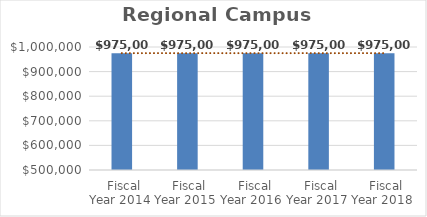
| Category | Regional Campus Administration |
|---|---|
| Fiscal Year 2014 | 975000 |
| Fiscal Year 2015 | 975000 |
| Fiscal Year 2016 | 975000 |
| Fiscal Year 2017 | 975000 |
| Fiscal Year 2018 | 975000 |